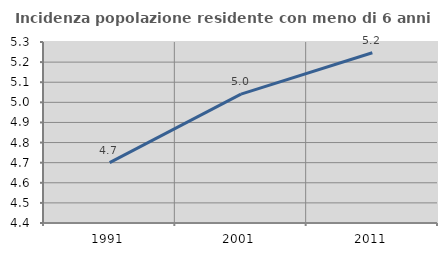
| Category | Incidenza popolazione residente con meno di 6 anni |
|---|---|
| 1991.0 | 4.7 |
| 2001.0 | 5.041 |
| 2011.0 | 5.246 |